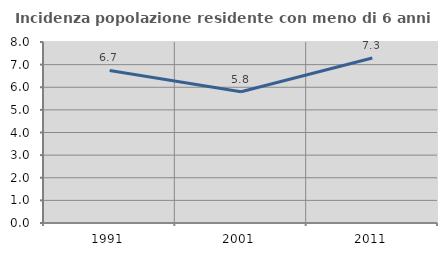
| Category | Incidenza popolazione residente con meno di 6 anni |
|---|---|
| 1991.0 | 6.741 |
| 2001.0 | 5.801 |
| 2011.0 | 7.295 |